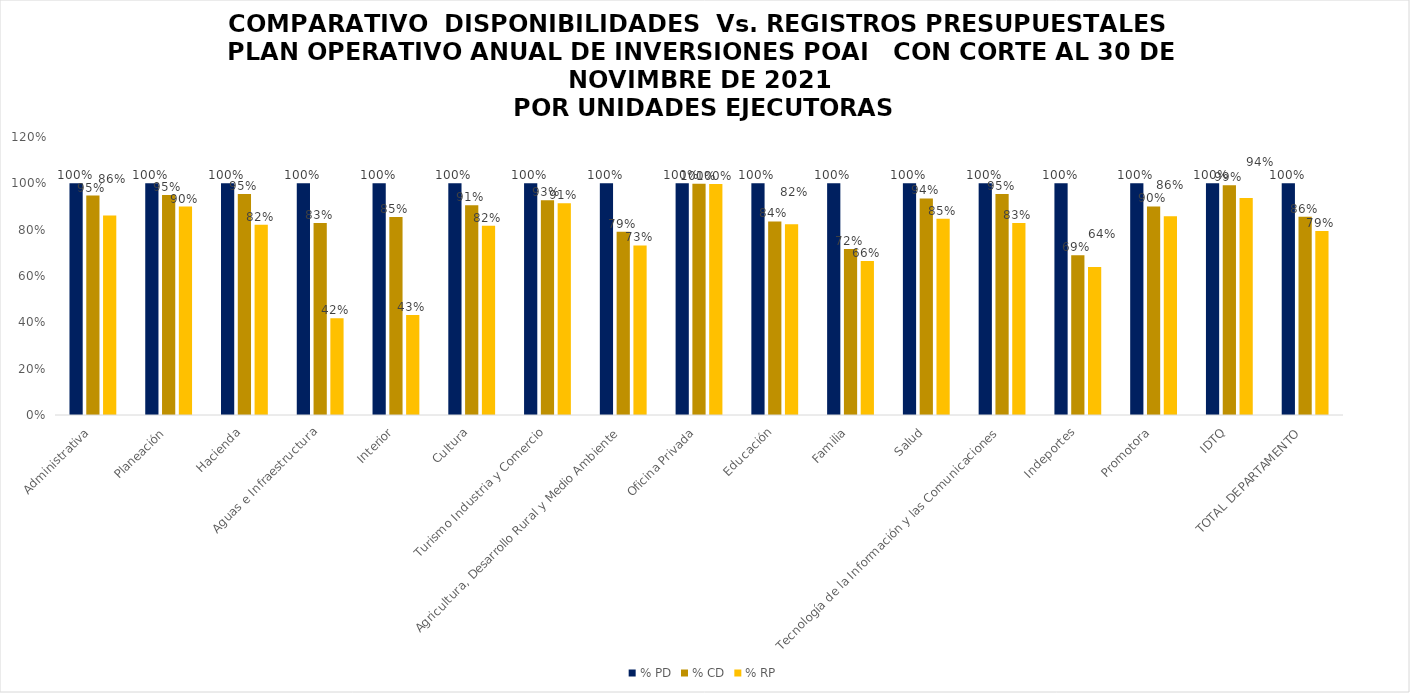
| Category |  % PD  |  % CD  |  % RP  |
|---|---|---|---|
| Administrativa | 1 | 0.947 | 0.861 |
| Planeación | 1 | 0.95 | 0.9 |
| Hacienda | 1 | 0.954 | 0.822 |
| Aguas e Infraestructura | 1 | 0.829 | 0.418 |
| Interior | 1 | 0.855 | 0.431 |
| Cultura | 1 | 0.905 | 0.816 |
| Turismo Industria y Comercio | 1 | 0.927 | 0.914 |
| Agricultura, Desarrollo Rural y Medio Ambiente | 1 | 0.791 | 0.732 |
| Oficina Privada | 1 | 0.998 | 0.997 |
| Educación | 1 | 0.835 | 0.824 |
| Familia | 1 | 0.716 | 0.665 |
| Salud | 1 | 0.935 | 0.847 |
| Tecnología de la Información y las Comunicaciones | 1 | 0.954 | 0.829 |
| Indeportes | 1 | 0.69 | 0.639 |
| Promotora | 1 | 0.9 | 0.858 |
| IDTQ | 1 | 0.992 | 0.936 |
| TOTAL DEPARTAMENTO | 1 | 0.856 | 0.795 |